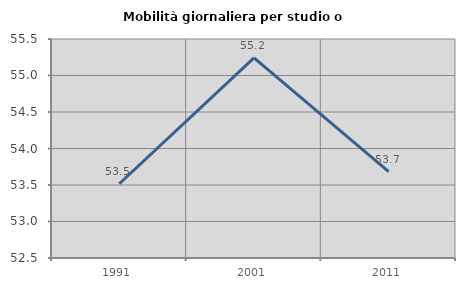
| Category | Mobilità giornaliera per studio o lavoro |
|---|---|
| 1991.0 | 53.517 |
| 2001.0 | 55.241 |
| 2011.0 | 53.683 |